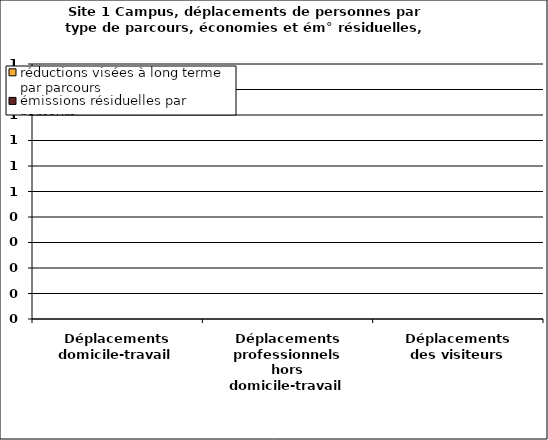
| Category | émissions résiduelles par parcours | réductions visées à long terme par parcours |
|---|---|---|
| Déplacements domicile-travail | 0 | 0 |
| Déplacements professionnels hors domicile-travail | 0 | 0 |
| Déplacements des visiteurs | 0 | 0 |